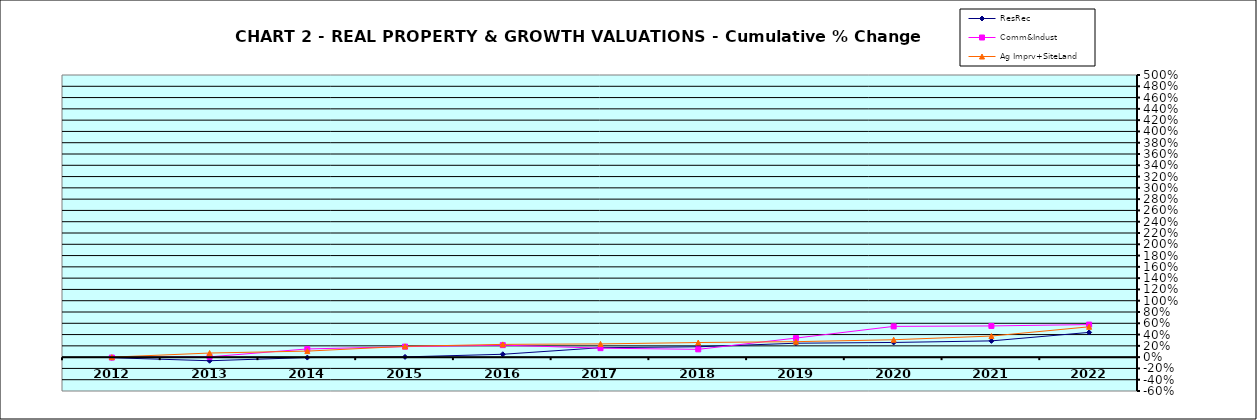
| Category | ResRec | Comm&Indust | Ag Imprv+SiteLand |
|---|---|---|---|
| 2012.0 | -0.01 | -0.007 | 0 |
| 2013.0 | -0.064 | 0.006 | 0.073 |
| 2014.0 | -0.008 | 0.145 | 0.107 |
| 2015.0 | 0.004 | 0.186 | 0.191 |
| 2016.0 | 0.051 | 0.213 | 0.226 |
| 2017.0 | 0.167 | 0.159 | 0.234 |
| 2018.0 | 0.184 | 0.138 | 0.259 |
| 2019.0 | 0.247 | 0.338 | 0.274 |
| 2020.0 | 0.26 | 0.545 | 0.308 |
| 2021.0 | 0.288 | 0.553 | 0.374 |
| 2022.0 | 0.438 | 0.577 | 0.538 |